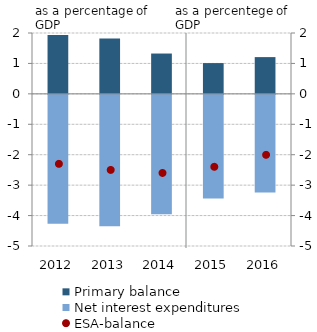
| Category | Primary balance |
|---|---|
| 2012.0 | 1.938 |
| 2013.0 | 1.821 |
| 2014.0 | 1.325 |
| 2015.0 | 1.011 |
| 2016.0 | 1.208 |